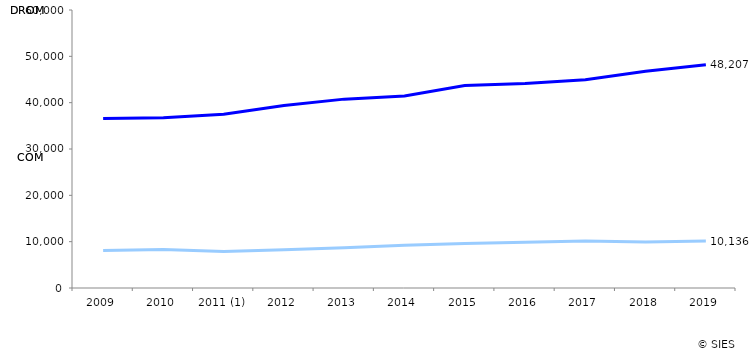
| Category | DROM | COM |
|---|---|---|
| 2009 | 36564 | 8114 |
| 2010 | 36745 | 8311 |
| 2011 (1) | 37517 | 7867 |
| 2012 | 39410 | 8242 |
| 2013 | 40763 | 8666 |
| 2014 | 41427 | 9215 |
| 2015 | 43691 | 9586 |
| 2016 | 44142 | 9875 |
| 2017 | 44934 | 10132 |
| 2018 | 46757 | 9949 |
| 2019 | 48207 | 10136 |